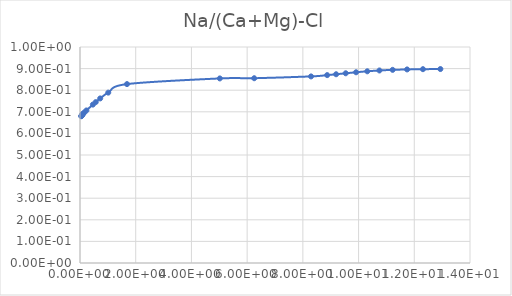
| Category | Series 0 |
|---|---|
| 0.045799 | 0.679 |
| 0.050887 | 0.681 |
| 0.057259 | 0.682 |
| 0.065457 | 0.684 |
| 0.076371 | 0.686 |
| 0.091686 | 0.688 |
| 0.11463 | 0.691 |
| 0.15299 | 0.697 |
| 0.22971 | 0.706 |
| 0.46165 | 0.733 |
| 0.56409 | 0.745 |
| 0.72494 | 0.762 |
| 1.0141 | 0.789 |
| 1.6871 | 0.828 |
| 5.0184 | 0.854 |
| 6.2531 | 0.855 |
| 8.2936 | 0.864 |
| 8.8726 | 0.87 |
| 9.1936 | 0.874 |
| 9.5386 | 0.878 |
| 9.9106 | 0.883 |
| 10.313 | 0.888 |
| 10.749 | 0.891 |
| 11.223 | 0.894 |
| 11.742 | 0.896 |
| 12.311 | 0.897 |
| 12.937 | 0.898 |